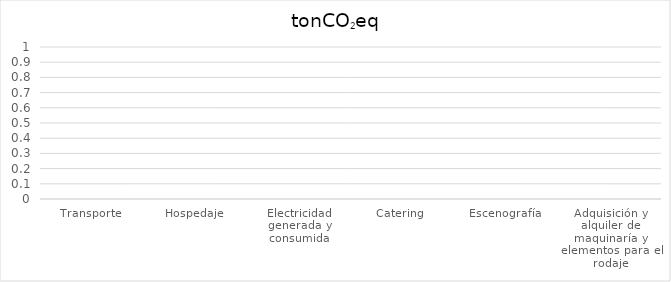
| Category | tonCO2eq |
|---|---|
| Transporte | 0 |
| Hospedaje | 0 |
| Electricidad generada y consumida | 0 |
| Catering  | 0 |
| Escenografía | 0 |
| Adquisición y alquiler de maquinaría y elementos para el rodaje | 0 |